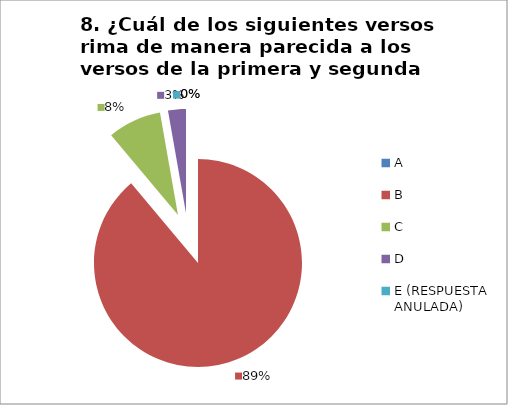
| Category | CANTIDAD DE RESPUESTAS PREGUNTA (8) | PORCENTAJE |
|---|---|---|
| A | 0 | 0 |
| B | 32 | 0.889 |
| C | 3 | 0.083 |
| D | 1 | 0.028 |
| E (RESPUESTA ANULADA) | 0 | 0 |